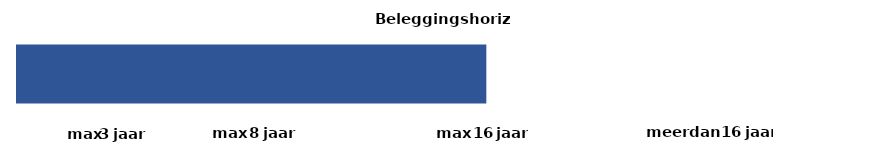
| Category | Beleggingshorizon |
|---|---|
| 0 | 16 |